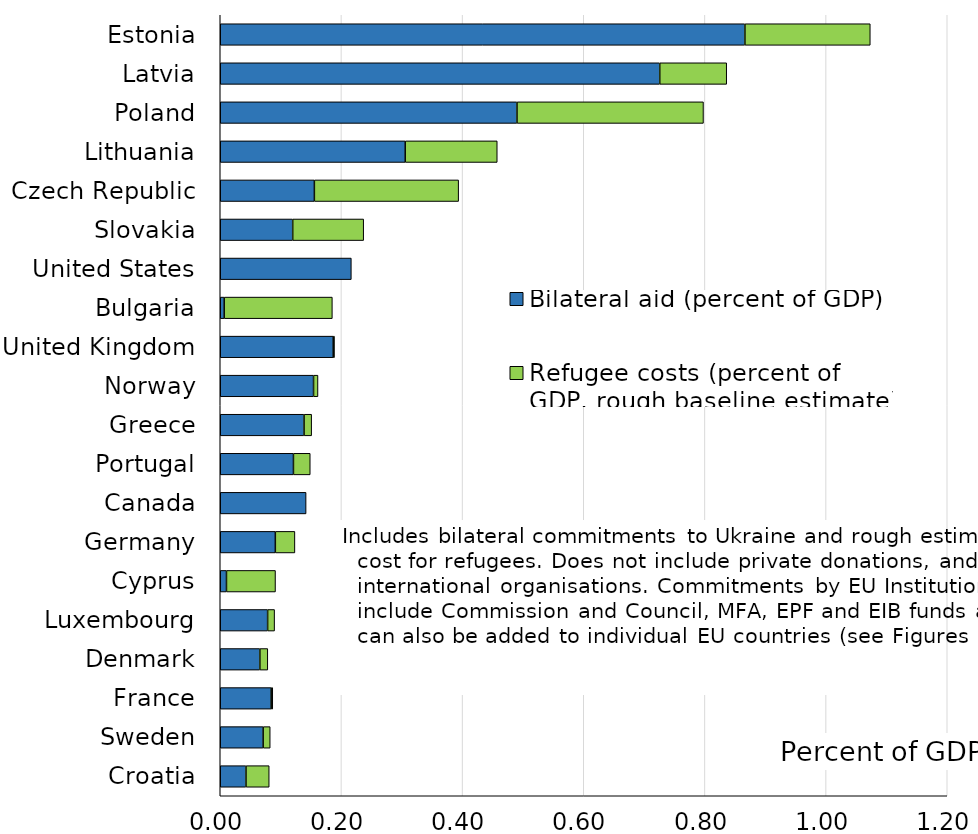
| Category | Bilateral aid (percent of GDP) | Refugee costs (percent of GDP, rough baseline estimate) |
|---|---|---|
| Estonia | 0.866 | 0.207 |
| Latvia | 0.725 | 0.111 |
| Poland | 0.49 | 0.308 |
| Lithuania | 0.305 | 0.152 |
| Czech Republic | 0.155 | 0.238 |
| Slovakia | 0.12 | 0.117 |
| United States | 0.216 | 0 |
| Bulgaria | 0.007 | 0.179 |
| United Kingdom | 0.186 | 0.002 |
| Norway | 0.154 | 0.007 |
| Greece | 0.138 | 0.013 |
| Portugal | 0.121 | 0.028 |
| Canada | 0.142 | 0 |
| Germany | 0.091 | 0.032 |
| Cyprus | 0.01 | 0.081 |
| Luxembourg | 0.078 | 0.012 |
| Denmark | 0.065 | 0.013 |
| France | 0.084 | 0.003 |
| Sweden | 0.071 | 0.012 |
| Croatia | 0.042 | 0.038 |